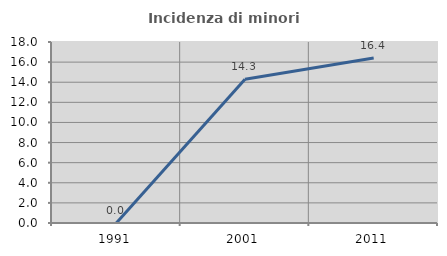
| Category | Incidenza di minori stranieri |
|---|---|
| 1991.0 | 0 |
| 2001.0 | 14.286 |
| 2011.0 | 16.418 |